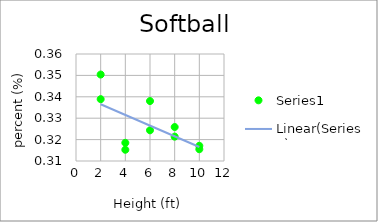
| Category | Series 0 |
|---|---|
| 10.0 | 0.317 |
| 10.0 | 0.316 |
| 8.0 | 0.321 |
| 8.0 | 0.326 |
| 6.0 | 0.324 |
| 6.0 | 0.338 |
| 4.0 | 0.318 |
| 4.0 | 0.315 |
| 2.0 | 0.339 |
| 2.0 | 0.35 |